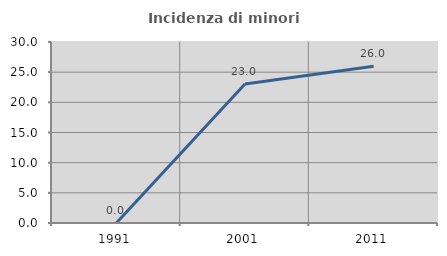
| Category | Incidenza di minori stranieri |
|---|---|
| 1991.0 | 0 |
| 2001.0 | 23.026 |
| 2011.0 | 25.987 |